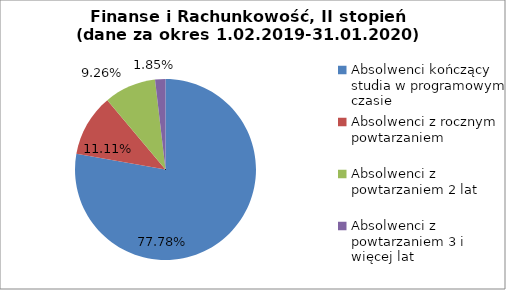
| Category | Series 0 |
|---|---|
| Absolwenci kończący studia w programowym czasie | 77.778 |
| Absolwenci z rocznym powtarzaniem | 11.111 |
| Absolwenci z powtarzaniem 2 lat | 9.259 |
| Absolwenci z powtarzaniem 3 i więcej lat | 1.852 |